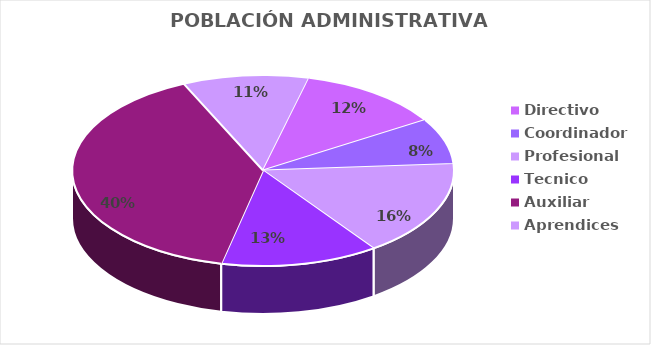
| Category | Directivo |
|---|---|
| Directivo | 0.123 |
| Coordinador  | 0.078 |
| Profesional  | 0.163 |
| Tecnico | 0.133 |
| Auxiliar  | 0.397 |
| Aprendices | 0.107 |